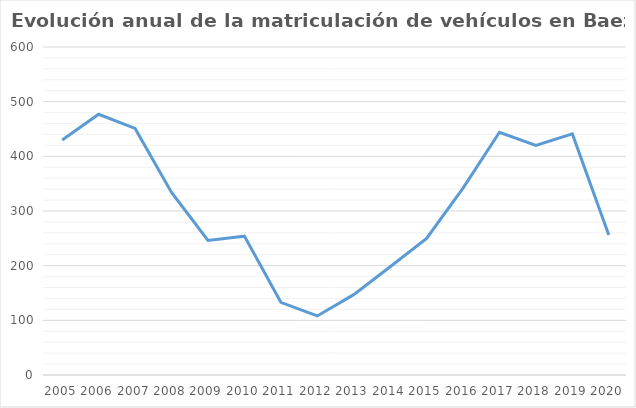
| Category | Series 0 |
|---|---|
| 2005 | 430 |
| 2006 | 477 |
| 2007 | 451 |
| 2008 | 334 |
| 2009 | 246 |
| 2010 | 254 |
| 2011 | 133 |
| 2012 | 108 |
| 2013 | 147 |
| 2014 | 198 |
| 2015 | 250 |
| 2016 | 342 |
| 2017 | 444 |
| 2018 | 420 |
| 2019 | 441 |
| 2020 | 256 |